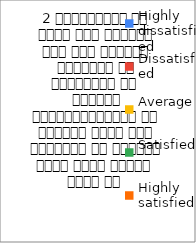
| Category | 2 व्याख्यान से रूचि में वृद्धि हुई एवं शिक्षण जानकारी से परिपूर्ण था 
शिक्षक विद्यार्थियों के द्वारा पूछे गये प्रश्नो का समाधान करने हेतु तत्पर  रहते है  |
|---|---|
| Highly dissatisfied | 0 |
| Dissatisfied | 0 |
| Average | 2 |
| Satisfied | 16 |
| Highly satisfied | 35 |